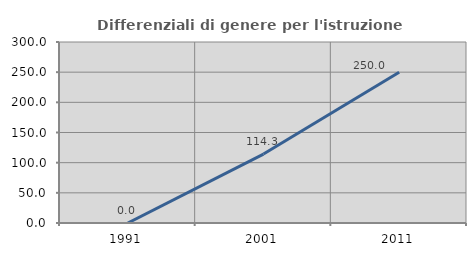
| Category | Differenziali di genere per l'istruzione superiore |
|---|---|
| 1991.0 | 0 |
| 2001.0 | 114.286 |
| 2011.0 | 250 |